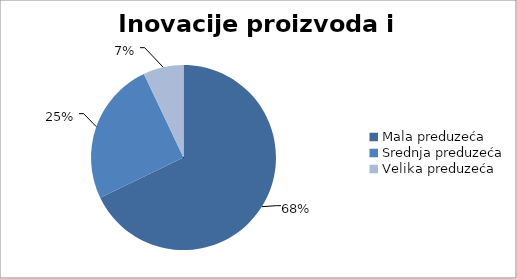
| Category | Inovacije proizvoda i usluga  |
|---|---|
| Mala preduzeća | 779.529 |
| Srednja preduzeća | 288.328 |
| Velika preduzeća | 80.92 |